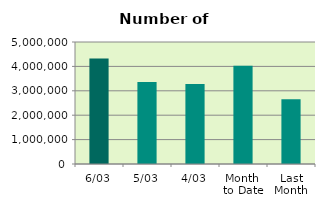
| Category | Series 0 |
|---|---|
| 6/03 | 4323220 |
| 5/03 | 3355708 |
| 4/03 | 3276906 |
| Month 
to Date | 4029677.6 |
| Last
Month | 2656039 |